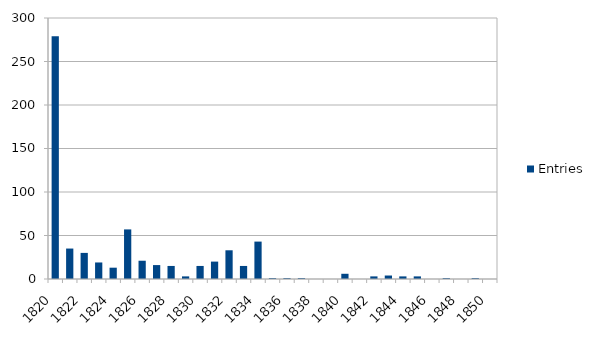
| Category | Entries |
|---|---|
| 1820 | 279 |
| 1821 | 35 |
| 1822 | 30 |
| 1823 | 19 |
| 1824 | 13 |
| 1825 | 57 |
| 1826 | 21 |
| 1827 | 16 |
| 1828 | 15 |
| 1829 | 3 |
| 1830 | 15 |
| 1831 | 20 |
| 1832 | 33 |
| 1833 | 15 |
| 1834 | 43 |
| 1835 | 1 |
| 1836 | 1 |
| 1837 | 1 |
| 1838 | 0 |
| 1839 | 0 |
| 1840 | 6 |
| 1841 | 0 |
| 1842 | 3 |
| 1843 | 4 |
| 1844 | 3 |
| 1845 | 3 |
| 1846 | 0 |
| 1847 | 1 |
| 1848 | 0 |
| 1849 | 1 |
| 1850 | 0 |